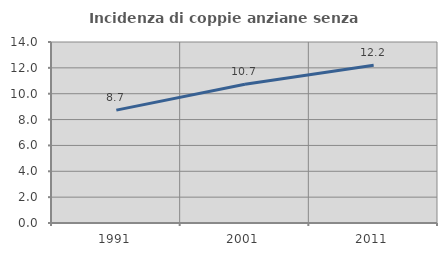
| Category | Incidenza di coppie anziane senza figli  |
|---|---|
| 1991.0 | 8.729 |
| 2001.0 | 10.734 |
| 2011.0 | 12.195 |